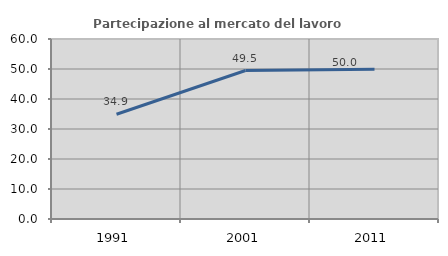
| Category | Partecipazione al mercato del lavoro  femminile |
|---|---|
| 1991.0 | 34.927 |
| 2001.0 | 49.491 |
| 2011.0 | 49.956 |